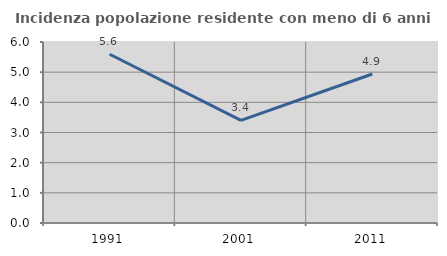
| Category | Incidenza popolazione residente con meno di 6 anni |
|---|---|
| 1991.0 | 5.593 |
| 2001.0 | 3.404 |
| 2011.0 | 4.94 |